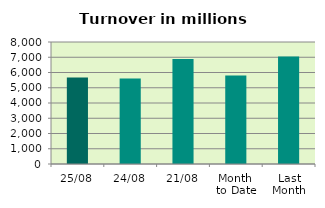
| Category | Series 0 |
|---|---|
| 25/08 | 5670.27 |
| 24/08 | 5608.3 |
| 21/08 | 6882.313 |
| Month 
to Date | 5801.908 |
| Last
Month | 7041.386 |